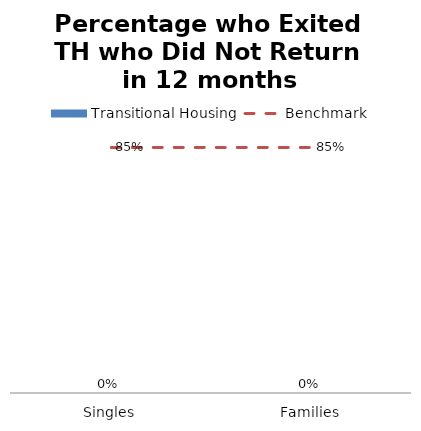
| Category | Transitional Housing |
|---|---|
| Singles | 0 |
| Families | 0 |